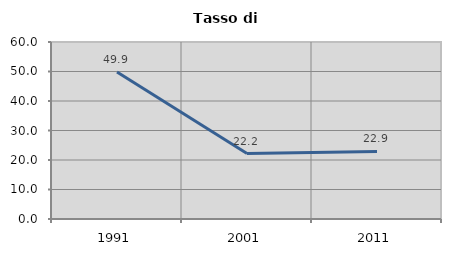
| Category | Tasso di disoccupazione   |
|---|---|
| 1991.0 | 49.858 |
| 2001.0 | 22.179 |
| 2011.0 | 22.901 |